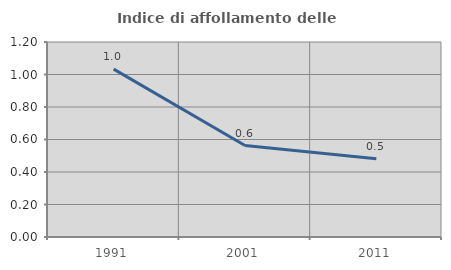
| Category | Indice di affollamento delle abitazioni  |
|---|---|
| 1991.0 | 1.033 |
| 2001.0 | 0.563 |
| 2011.0 | 0.482 |